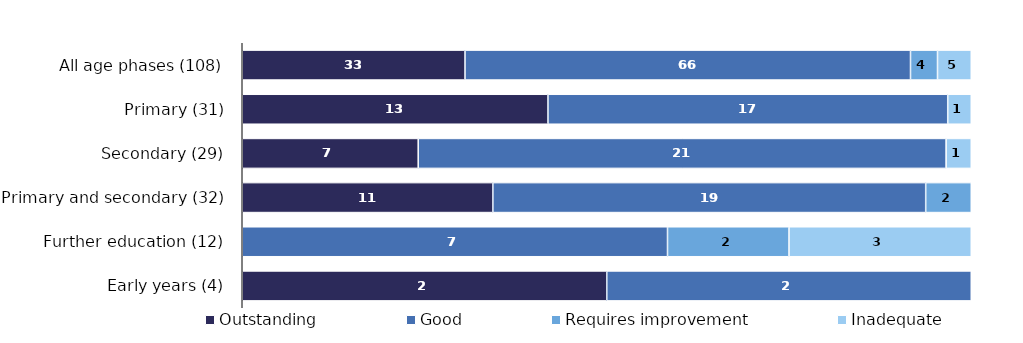
| Category | Outstanding | Good | Requires improvement | Inadequate |
|---|---|---|---|---|
| All age phases (108) | 33 | 66 | 4 | 5 |
| Primary (31) | 13 | 17 | 0 | 1 |
| Secondary (29) | 7 | 21 | 0 | 1 |
| Primary and secondary (32) | 11 | 19 | 2 | 0 |
| Further education (12) | 0 | 7 | 2 | 3 |
| Early years (4) | 2 | 2 | 0 | 0 |